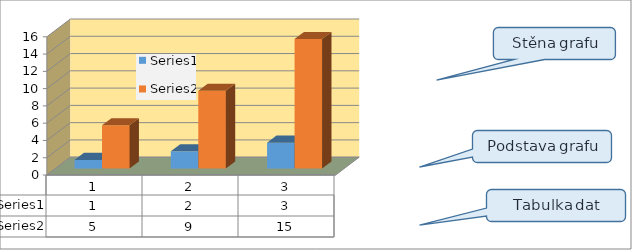
| Category | Series 0 | Series 1 |
|---|---|---|
| 0 | 1 | 5 |
| 1 | 2 | 9 |
| 2 | 3 | 15 |